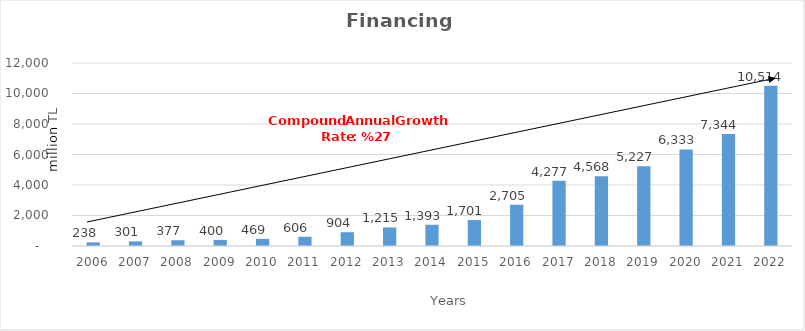
| Category | Financing |
|---|---|
| 2006.0 | 237.908 |
| 2007.0 | 300.915 |
| 2008.0 | 377.007 |
| 2009.0 | 400.22 |
| 2010.0 | 468.569 |
| 2011.0 | 605.744 |
| 2012.0 | 904.24 |
| 2013.0 | 1214.696 |
| 2014.0 | 1393 |
| 2015.0 | 1701 |
| 2016.0 | 2705 |
| 2017.0 | 4277 |
| 2018.0 | 4568 |
| 2019.0 | 5227 |
| 2020.0 | 6333 |
| 2021.0 | 7344 |
| 2022.0 | 10514 |